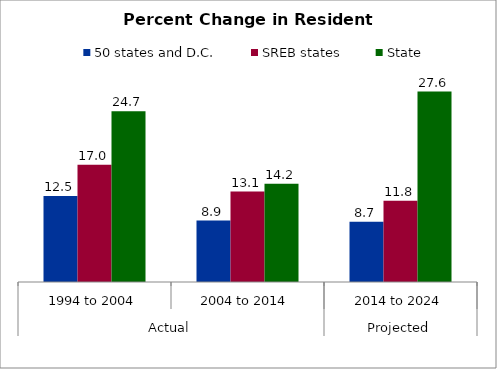
| Category | 50 states and D.C. | SREB states | State |
|---|---|---|---|
| 0 | 12.476 | 17.007 | 24.735 |
| 1 | 8.897 | 13.1 | 14.229 |
| 2 | 8.722 | 11.77 | 27.595 |